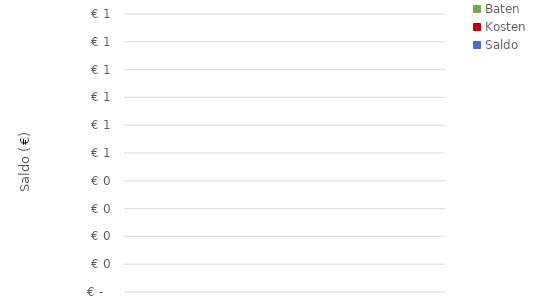
| Category | Baten | Kosten | Saldo |
|---|---|---|---|
| 0.0 | 0 | 0 | 0 |